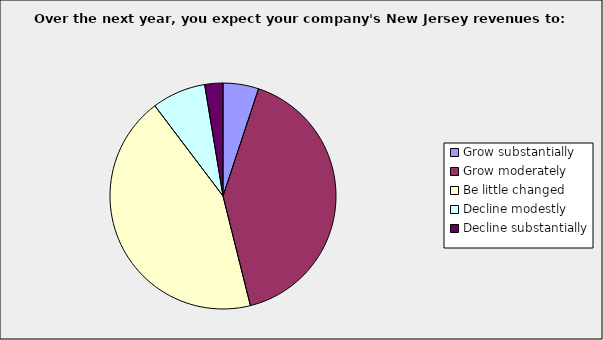
| Category | Series 0 |
|---|---|
| Grow substantially | 0.051 |
| Grow moderately | 0.41 |
| Be little changed | 0.436 |
| Decline modestly | 0.077 |
| Decline substantially | 0.026 |